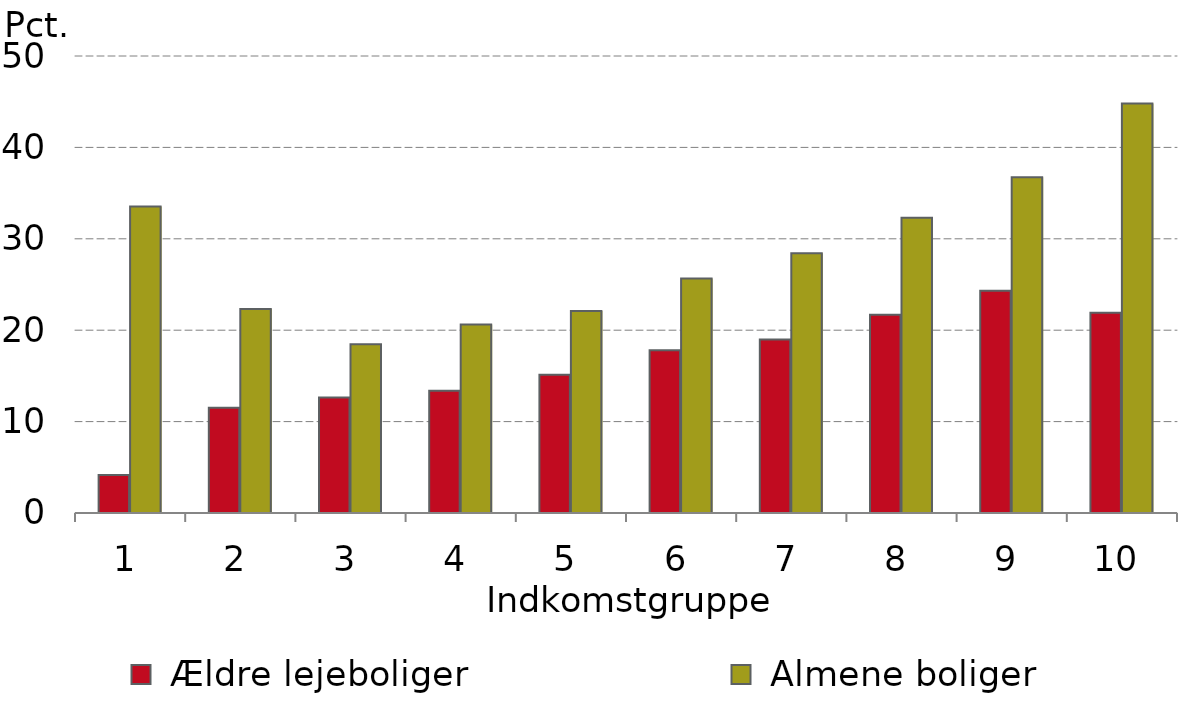
| Category |  Ældre lejeboliger |  Almene boliger |
|---|---|---|
| 0 | 4.168 | 33.521 |
| 1 | 11.511 | 22.316 |
| 2 | 12.642 | 18.467 |
| 3 | 13.377 | 20.63 |
| 4 | 15.135 | 22.112 |
| 5 | 17.795 | 25.662 |
| 6 | 18.971 | 28.431 |
| 7 | 21.69 | 32.315 |
| 8 | 24.307 | 36.742 |
| 9 | 21.906 | 44.8 |